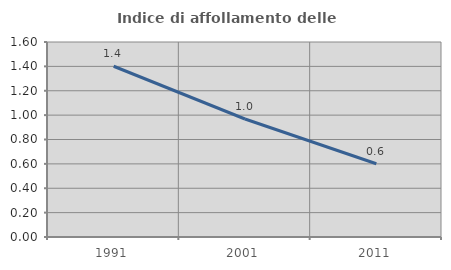
| Category | Indice di affollamento delle abitazioni  |
|---|---|
| 1991.0 | 1.401 |
| 2001.0 | 0.968 |
| 2011.0 | 0.601 |